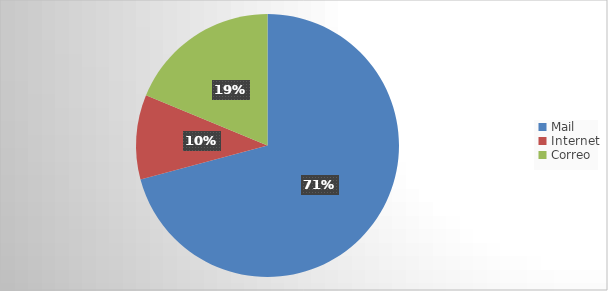
| Category | Series 0 |
|---|---|
| Mail | 34 |
| Internet | 5 |
| Correo | 9 |